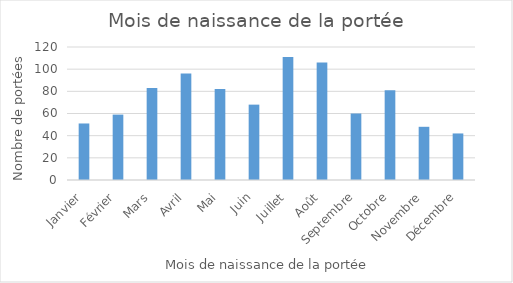
| Category | Series 0 |
|---|---|
| Janvier | 51 |
| Février | 59 |
| Mars | 83 |
| Avril | 96 |
| Mai | 82 |
| Juin | 68 |
| Juillet | 111 |
| Août | 106 |
| Septembre | 60 |
| Octobre | 81 |
| Novembre | 48 |
| Décembre | 42 |